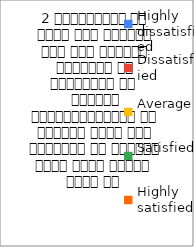
| Category | 2 व्याख्यान से रूचि में वृद्धि हुई एवं शिक्षण जानकारी से परिपूर्ण था 
शिक्षक विद्यार्थियों के द्वारा पूछे गये प्रश्नो का समाधान करने हेतु तत्पर  रहते है  |
|---|---|
| Highly dissatisfied | 0 |
| Dissatisfied | 0 |
| Average | 1 |
| Satisfied | 20 |
| Highly satisfied | 34 |